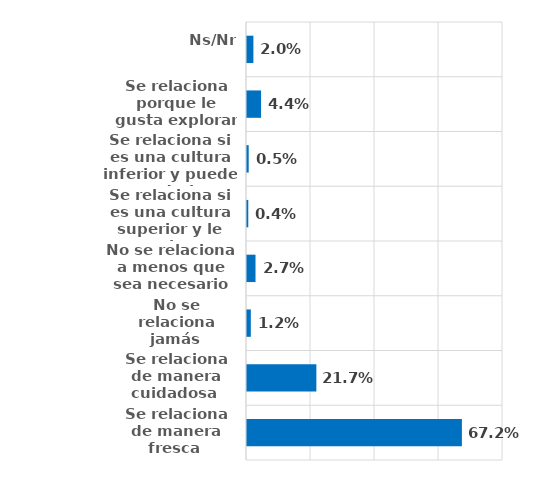
| Category | Series 0 |
|---|---|
| Se relaciona de manera fresca  | 0.672 |
| Se relaciona de manera cuidadosa  | 0.217 |
| No se relaciona jamás  | 0.012 |
| No se relaciona a menos que sea necesario | 0.027 |
| Se relaciona si es una cultura superior y le conviene  | 0.004 |
| Se relaciona si es una cultura inferior y puede ayudarle  | 0.005 |
| Se relaciona porque le gusta explorar cosas desconocidas  | 0.044 |
| Ns/Nr | 0.02 |